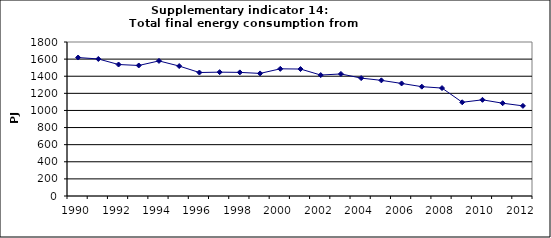
| Category | Total final energy consumption from industry, PJ |
|---|---|
| 1990 | 1618.6 |
| 1991 | 1601.732 |
| 1992 | 1536.999 |
| 1993 | 1525.662 |
| 1994 | 1578.897 |
| 1995 | 1518.823 |
| 1996 | 1443.198 |
| 1997 | 1447.69 |
| 1998 | 1444.955 |
| 1999 | 1432.801 |
| 2000 | 1486.572 |
| 2001 | 1483.912 |
| 2002 | 1413.626 |
| 2003 | 1426.618 |
| 2004 | 1377.978 |
| 2005 | 1351.558 |
| 2006 | 1315.58 |
| 2007 | 1277.912 |
| 2008 | 1261.552 |
| 2009 | 1095.512 |
| 2010 | 1124.162 |
| 2011 | 1084.527 |
| 2012 | 1053.564 |